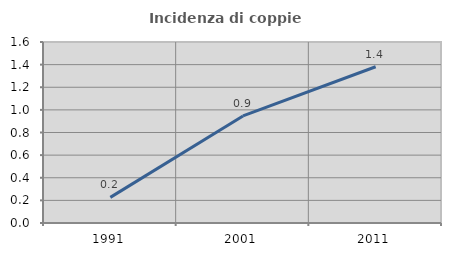
| Category | Incidenza di coppie miste |
|---|---|
| 1991.0 | 0.227 |
| 2001.0 | 0.947 |
| 2011.0 | 1.381 |